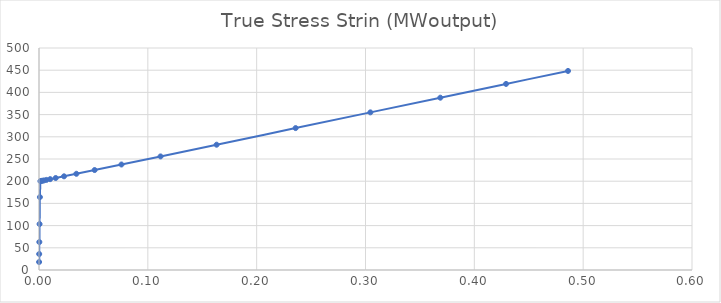
| Category | Series 0 |
|---|---|
| 8.99959502429071e-05 | 17.998 |
| 0.000179983801943807 | 35.996 |
| 0.000314950397916229 | 62.988 |
| 0.000517366143053604 | 103.471 |
| 0.000820912958736214 | 164.18 |
| 0.00127606548202025 | 200.13 |
| 0.00195839109970242 | 200.471 |
| 0.00298102233448872 | 200.981 |
| 0.00451300107383731 | 201.747 |
| 0.00680658256963524 | 202.893 |
| 0.0102371214079935 | 204.608 |
| 0.0153610132102306 | 207.172 |
| 0.0229978113721286 | 210.999 |
| 0.0343449033807882 | 216.695 |
| 0.0511277156801529 | 225.142 |
| 0.0757852575808854 | 237.599 |
| 0.111667484848671 | 255.822 |
| 0.163187156184584 | 282.169 |
| 0.235807819867008 | 319.641 |
| 0.304488303267768 | 355.029 |
| 0.368753404755717 | 388.085 |
| 0.429136711841463 | 419.099 |
| 0.486080574800857 | 448.308 |